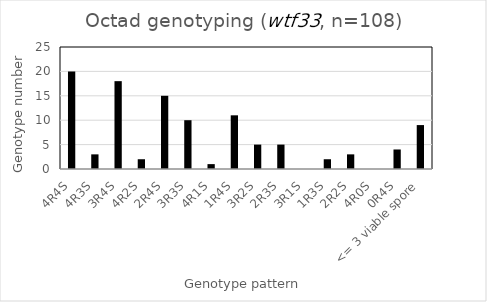
| Category | Number |
|---|---|
| 4R4S | 20 |
| 4R3S | 3 |
| 3R4S | 18 |
| 4R2S | 2 |
| 2R4S | 15 |
| 3R3S | 10 |
| 4R1S | 1 |
| 1R4S | 11 |
| 3R2S | 5 |
| 2R3S | 5 |
| 3R1S | 0 |
| 1R3S | 2 |
| 2R2S | 3 |
| 4R0S | 0 |
| 0R4S | 4 |
| <= 3 viable spore | 9 |